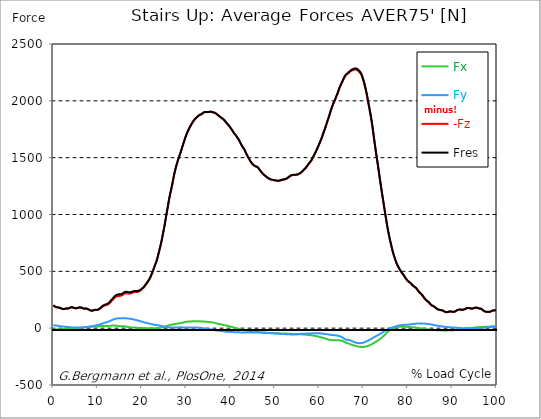
| Category |  Fx |  Fy |  -Fz |  Fres |
|---|---|---|---|---|
| 0.0 | -10.985 | 26.867 | 199.371 | 201.648 |
| 0.16678370786516855 | -11.29 | 25.648 | 194.254 | 196.474 |
| 0.3335674157303371 | -11.566 | 24.466 | 189.281 | 191.444 |
| 0.5003511235955057 | -11.538 | 23.638 | 185.613 | 187.738 |
| 0.6671348314606742 | -11.347 | 22.913 | 183.565 | 185.623 |
| 0.8339185393258427 | -10.995 | 22.027 | 182.326 | 184.251 |
| 1.0007022471910114 | -10.433 | 20.932 | 181.478 | 183.241 |
| 1.1674859550561796 | -9.975 | 19.693 | 180.706 | 182.317 |
| 1.3342696629213484 | -9.813 | 18.569 | 179.363 | 180.859 |
| 1.5010533707865168 | -9.747 | 17.483 | 177.467 | 178.896 |
| 1.6678370786516854 | -9.689 | 16.578 | 175.057 | 176.419 |
| 1.8346207865168538 | -9.404 | 15.835 | 172.408 | 173.704 |
| 2.001404494382023 | -8.794 | 15.206 | 169.331 | 170.588 |
| 2.1681882022471908 | -8.155 | 14.567 | 166.854 | 168.045 |
| 2.334971910112359 | -7.393 | 13.967 | 166.749 | 167.844 |
| 2.501755617977528 | -6.288 | 13.443 | 168.235 | 169.235 |
| 2.668539325842697 | -5.164 | 12.662 | 170.512 | 171.379 |
| 2.8353230337078656 | -4.535 | 11.719 | 172.599 | 173.37 |
| 3.0021067415730336 | -4.402 | 10.985 | 173.246 | 173.98 |
| 3.168890449438202 | -4.144 | 10.309 | 173.094 | 173.809 |
| 3.335674157303371 | -3.697 | 9.708 | 172.923 | 173.589 |
| 3.502457865168539 | -2.858 | 9.089 | 175.276 | 175.895 |
| 3.6692415730337076 | -2.21 | 8.441 | 177.982 | 178.544 |
| 3.8360252808988764 | -1.41 | 7.736 | 181.516 | 182.05 |
| 4.002808988764046 | -0.696 | 7.136 | 184.184 | 184.698 |
| 4.169592696629214 | -0.238 | 6.726 | 184.308 | 184.803 |
| 4.3363764044943816 | 0.019 | 6.393 | 182.574 | 183.06 |
| 4.50316011235955 | 0.152 | 6.155 | 180.602 | 181.078 |
| 4.669943820224718 | 0.21 | 5.945 | 178.001 | 178.477 |
| 4.836727528089888 | 0.391 | 5.755 | 175.752 | 176.238 |
| 5.003511235955056 | 1.038 | 5.574 | 175.038 | 175.533 |
| 5.170294943820225 | 1.934 | 5.412 | 175.19 | 175.686 |
| 5.337078651685394 | 2.696 | 5.25 | 176.19 | 176.695 |
| 5.5038623595505625 | 3.401 | 5.011 | 177.944 | 178.448 |
| 5.670646067415731 | 4.002 | 4.764 | 180.154 | 180.659 |
| 5.837429775280899 | 4.573 | 4.497 | 182.469 | 182.964 |
| 6.004213483146067 | 4.907 | 4.449 | 183.088 | 183.584 |
| 6.170997191011236 | 5.24 | 4.687 | 181.84 | 182.345 |
| 6.329002808988764 | 5.526 | 4.935 | 179.992 | 180.506 |
| 6.495786516853932 | 6.145 | 5.316 | 177.61 | 178.134 |
| 6.662570224719101 | 6.926 | 5.936 | 174.704 | 175.257 |
| 6.82935393258427 | 7.612 | 6.45 | 172.427 | 173.027 |
| 6.9961376404494375 | 8.413 | 6.945 | 171.255 | 171.894 |
| 7.162921348314607 | 9.346 | 7.508 | 171.636 | 172.332 |
| 7.329705056179775 | 10.185 | 8.041 | 172.332 | 173.075 |
| 7.496488764044945 | 10.785 | 8.727 | 171.808 | 172.618 |
| 7.663272471910113 | 11.166 | 9.823 | 169.94 | 170.827 |
| 7.830056179775281 | 11.395 | 10.842 | 167.101 | 168.083 |
| 7.996839887640449 | 11.595 | 12.119 | 162.795 | 163.881 |
| 8.16362359550562 | 11.824 | 13.5 | 158.231 | 159.441 |
| 8.330407303370787 | 12.147 | 14.767 | 155.792 | 157.155 |
| 8.497191011235955 | 12.586 | 15.92 | 153.544 | 155.068 |
| 8.663974719101123 | 13.129 | 16.997 | 152.296 | 153.992 |
| 8.830758426966291 | 13.786 | 18.131 | 153.239 | 155.087 |
| 8.99754213483146 | 14.272 | 19.264 | 154.887 | 156.878 |
| 9.16432584269663 | 14.663 | 20.427 | 157.126 | 159.26 |
| 9.331109550561798 | 14.701 | 21.532 | 158.927 | 161.175 |
| 9.497893258426966 | 14.444 | 22.618 | 159.051 | 161.423 |
| 9.664676966292134 | 14.482 | 24.266 | 159.108 | 161.737 |
| 9.831460674157304 | 14.529 | 25.905 | 159.165 | 162.052 |
| 9.998244382022472 | 14.853 | 27.82 | 159.851 | 163.081 |
| 10.16502808988764 | 15.701 | 29.726 | 162.299 | 165.891 |
| 10.331811797752808 | 16.511 | 31.621 | 166.063 | 169.998 |
| 10.498595505617978 | 17.311 | 33.527 | 170.16 | 174.409 |
| 10.665379213483147 | 17.969 | 35.652 | 175.257 | 179.859 |
| 10.832162921348315 | 18.483 | 37.9 | 181.259 | 186.213 |
| 10.998946629213483 | 18.969 | 40.11 | 187.147 | 192.454 |
| 11.165730337078653 | 19.245 | 42.149 | 191.692 | 197.322 |
| 11.33251404494382 | 19.198 | 44.207 | 195.455 | 201.438 |
| 11.49929775280899 | 19.131 | 46.227 | 198.256 | 204.611 |
| 11.666081460674157 | 19.16 | 48.695 | 200.495 | 207.336 |
| 11.832865168539326 | 18.845 | 50.572 | 202.057 | 209.27 |
| 11.999648876404493 | 18.531 | 52.182 | 203.572 | 211.118 |
| 12.166432584269662 | 18.416 | 54.097 | 205.535 | 213.49 |
| 12.333216292134832 | 18.931 | 56.612 | 209.041 | 217.53 |
| 12.5 | 19.569 | 59.013 | 213.376 | 222.37 |
| 12.66678370786517 | 20.341 | 61.366 | 219.073 | 228.515 |
| 12.833567415730336 | 21.227 | 63.872 | 225.885 | 235.794 |
| 13.000351123595506 | 21.894 | 67.264 | 233.86 | 244.407 |
| 13.167134831460674 | 22.523 | 70.446 | 240.777 | 251.952 |
| 13.333918539325843 | 22.751 | 72.97 | 246.741 | 258.374 |
| 13.500702247191011 | 22.666 | 75.705 | 252.896 | 265.015 |
| 13.667485955056181 | 22.599 | 78.334 | 260.403 | 272.922 |
| 13.834269662921349 | 22.447 | 80.85 | 267.682 | 280.582 |
| 14.001053370786519 | 21.818 | 82.641 | 273.246 | 286.356 |
| 14.167837078651687 | 21.437 | 83.984 | 277.01 | 290.3 |
| 14.334620786516853 | 20.998 | 85.118 | 280.182 | 293.616 |
| 14.501404494382026 | 20.589 | 85.794 | 282.421 | 295.931 |
| 14.668188202247192 | 20.074 | 86.166 | 283.841 | 297.379 |
| 14.834971910112362 | 19.16 | 86.147 | 284.012 | 297.513 |
| 15.001755617977528 | 18.293 | 86.137 | 284.05 | 297.522 |
| 15.168539325842698 | 17.416 | 86.128 | 284.088 | 297.532 |
| 15.335323033707864 | 17.025 | 86.366 | 286.07 | 299.475 |
| 15.502106741573034 | 16.835 | 86.919 | 289.062 | 302.476 |
| 15.6688904494382 | 16.644 | 87.309 | 293.139 | 306.468 |
| 15.83567415730337 | 16.482 | 87.786 | 298.275 | 311.508 |
| 16.00245786516854 | 16.12 | 88.033 | 302.886 | 315.967 |
| 16.16924157303371 | 15.568 | 87.919 | 306.001 | 318.883 |
| 16.336025280898877 | 14.739 | 87.49 | 307.059 | 319.75 |
| 16.502808988764045 | 13.472 | 86.861 | 307.345 | 319.807 |
| 16.669592696629216 | 12.224 | 86.042 | 306.64 | 318.873 |
| 16.83637640449438 | 10.814 | 85.118 | 305.458 | 317.482 |
| 17.003160112359552 | 9.566 | 84.375 | 304.677 | 316.539 |
| 17.169943820224717 | 8.308 | 83.479 | 304.382 | 316.043 |
| 17.336727528089888 | 7.288 | 82.431 | 305.011 | 316.386 |
| 17.503511235955056 | 6.926 | 81.383 | 306.849 | 317.911 |
| 17.670294943820224 | 6.517 | 80.345 | 308.869 | 319.635 |
| 17.837078651685395 | 6.669 | 79.182 | 311.718 | 322.122 |
| 18.003862359550563 | 6.86 | 77.991 | 314.357 | 324.408 |
| 18.17064606741573 | 6.803 | 76.715 | 316.52 | 326.219 |
| 18.3374297752809 | 6.288 | 75.267 | 317.92 | 327.248 |
| 18.504213483146067 | 5.316 | 73.685 | 318.082 | 327.067 |
| 18.662219101123597 | 4.135 | 71.932 | 317.92 | 326.504 |
| 18.829002808988765 | 2.944 | 70.065 | 317.673 | 325.828 |
| 18.995786516853933 | 2.268 | 68.235 | 318.816 | 326.571 |
| 19.1625702247191 | 1.877 | 65.958 | 321.331 | 328.562 |
| 19.32935393258427 | 1.629 | 64.024 | 324.609 | 331.373 |
| 19.49613764044944 | 1.381 | 62.376 | 328.658 | 335.07 |
| 19.662921348314608 | 0.991 | 60.804 | 332.573 | 338.709 |
| 19.829705056179776 | 0.657 | 58.937 | 338.147 | 343.882 |
| 19.996488764044944 | 0.343 | 57.174 | 343.358 | 348.789 |
| 20.163272471910112 | -0.086 | 55.421 | 348.284 | 353.467 |
| 20.33005617977528 | -0.638 | 53.554 | 354.429 | 359.288 |
| 20.49683988764045 | -1.058 | 51.572 | 363.014 | 367.472 |
| 20.663623595505616 | -1.353 | 49.609 | 372.236 | 376.295 |
| 20.830407303370787 | -1.181 | 47.628 | 382.287 | 386.013 |
| 20.997191011235955 | -1.277 | 46.237 | 391.329 | 394.93 |
| 21.163974719101123 | -1.582 | 45.103 | 398.522 | 402.047 |
| 21.330758426966295 | -1.705 | 43.617 | 407.554 | 410.889 |
| 21.497542134831463 | -1.534 | 41.759 | 419.463 | 422.512 |
| 21.66432584269663 | -1.524 | 40.377 | 430.925 | 433.812 |
| 21.8311095505618 | -1.562 | 39.072 | 442.053 | 444.778 |
| 21.997893258426966 | -1.239 | 36.976 | 457.592 | 460.022 |
| 22.164676966292134 | -1.429 | 35.623 | 473.074 | 475.408 |
| 22.331460674157306 | -1.572 | 34.384 | 488.032 | 490.271 |
| 22.498244382022467 | -1.162 | 32.441 | 506.534 | 508.507 |
| 22.66502808988764 | -0.877 | 30.697 | 525.303 | 527.047 |
| 22.831811797752806 | -0.629 | 29.535 | 543.596 | 545.225 |
| 22.99859550561798 | -0.381 | 28.754 | 560.774 | 562.318 |
| 23.165379213483146 | -0.143 | 28.192 | 577.342 | 578.8 |
| 23.332162921348313 | 0.095 | 27.906 | 596.292 | 597.664 |
| 23.49894662921348 | 0.524 | 26.658 | 620.559 | 621.797 |
| 23.665730337078653 | 1.439 | 25.019 | 646.349 | 647.435 |
| 23.83251404494382 | 2.668 | 23.571 | 672.188 | 673.15 |
| 23.999297752808985 | 4.411 | 22.656 | 697.959 | 698.855 |
| 24.166081460674157 | 5.669 | 21.665 | 724.627 | 725.465 |
| 24.332865168539325 | 6.536 | 20.189 | 754.019 | 754.781 |
| 24.499648876404496 | 7.279 | 18.721 | 784.621 | 785.316 |
| 24.666432584269664 | 8.451 | 16.949 | 817.928 | 818.557 |
| 24.833216292134832 | 9.737 | 15.063 | 852.246 | 852.818 |
| 25.0 | 11.157 | 13.758 | 885.468 | 886.002 |
| 25.16678370786517 | 12.757 | 12.595 | 920.891 | 921.425 |
| 25.33356741573034 | 14.882 | 11.404 | 960.106 | 960.649 |
| 25.500351123595504 | 17.254 | 10.452 | 997.558 | 998.13 |
| 25.66713483146067 | 19.655 | 9.842 | 1035.468 | 1036.087 |
| 25.833918539325843 | 21.723 | 9.203 | 1070.891 | 1071.567 |
| 26.00070224719101 | 24.4 | 7.974 | 1109.982 | 1110.715 |
| 26.16748595505618 | 26.524 | 6.841 | 1145.1 | 1145.891 |
| 26.334269662921347 | 28.182 | 6.183 | 1176.988 | 1177.827 |
| 26.50105337078652 | 29.068 | 5.774 | 1206.361 | 1207.209 |
| 26.667837078651687 | 30.335 | 5.564 | 1236.211 | 1237.097 |
| 26.834620786516858 | 32.107 | 5.421 | 1268.118 | 1269.052 |
| 27.001404494382022 | 33.689 | 5.593 | 1300.997 | 1301.978 |
| 27.16818820224719 | 35.118 | 6.088 | 1334.981 | 1335.991 |
| 27.334971910112362 | 36.5 | 6.431 | 1365.879 | 1366.917 |
| 27.50175561797753 | 37.567 | 6.421 | 1392.794 | 1393.851 |
| 27.668539325842698 | 38.519 | 6.307 | 1418.68 | 1419.756 |
| 27.835323033707866 | 39.291 | 6.155 | 1441.393 | 1442.47 |
| 28.002106741573037 | 40.177 | 6.155 | 1463.049 | 1464.135 |
| 28.168890449438205 | 41.111 | 6.336 | 1485.229 | 1486.324 |
| 28.335674157303373 | 42.092 | 6.822 | 1505.027 | 1506.113 |
| 28.502457865168537 | 43.064 | 7.412 | 1522.652 | 1523.719 |
| 28.669241573033705 | 44.169 | 8.003 | 1541.421 | 1542.479 |
| 28.836025280898877 | 45.303 | 8.232 | 1561.886 | 1562.944 |
| 29.002808988764052 | 46.875 | 7.622 | 1582.856 | 1583.914 |
| 29.169592696629213 | 48.58 | 6.907 | 1603.483 | 1604.531 |
| 29.336376404494384 | 50.343 | 6.298 | 1623.529 | 1624.577 |
| 29.50316011235955 | 52.077 | 5.802 | 1643.565 | 1644.622 |
| 29.669943820224724 | 53.401 | 6.469 | 1664.115 | 1665.192 |
| 29.836727528089884 | 55.059 | 6.593 | 1682.665 | 1683.761 |
| 30.003511235955056 | 56.031 | 6.841 | 1700.367 | 1701.472 |
| 30.170294943820224 | 56.783 | 6.831 | 1716.83 | 1717.945 |
| 30.337078651685395 | 57.593 | 6.45 | 1731.531 | 1732.656 |
| 30.503862359550563 | 58.155 | 6.364 | 1745.479 | 1746.613 |
| 30.670646067415728 | 58.365 | 6.174 | 1759.037 | 1760.161 |
| 30.837429775280903 | 58.775 | 5.917 | 1771.356 | 1772.49 |
| 30.99543539325843 | 59.299 | 6.107 | 1783.113 | 1784.246 |
| 31.162219101123597 | 59.794 | 6.555 | 1794.698 | 1795.841 |
| 31.32900280898876 | 59.918 | 6.945 | 1805.845 | 1806.979 |
| 31.495786516853936 | 59.861 | 7.184 | 1816.544 | 1817.669 |
| 31.6625702247191 | 60.204 | 6.669 | 1825.738 | 1826.863 |
| 31.82935393258427 | 60.299 | 6.269 | 1834.456 | 1835.58 |
| 31.996137640449433 | 60.032 | 6.021 | 1841.754 | 1842.859 |
| 32.162921348314605 | 59.966 | 5.65 | 1848.061 | 1849.157 |
| 32.329705056179776 | 60.175 | 5.364 | 1853.597 | 1854.692 |
| 32.49648876404494 | 60.747 | 5.011 | 1858.732 | 1859.846 |
| 32.66327247191011 | 61.004 | 4.649 | 1865.41 | 1866.535 |
| 32.83005617977528 | 60.118 | 4.287 | 1872.137 | 1873.213 |
| 32.996839887640455 | 59.68 | 3.687 | 1875.767 | 1876.824 |
| 33.16362359550562 | 59.708 | 2.839 | 1878.168 | 1879.225 |
| 33.330407303370784 | 59.851 | 1.991 | 1880.188 | 1881.245 |
| 33.497191011235955 | 59.68 | 1.124 | 1883.455 | 1884.503 |
| 33.66397471910113 | 59.508 | -0.038 | 1889.724 | 1890.763 |
| 33.83075842696629 | 59.213 | -1.01 | 1895.546 | 1896.565 |
| 33.997542134831455 | 58.336 | -1.696 | 1899.195 | 1900.186 |
| 34.164325842696634 | 57.536 | -2.677 | 1900.643 | 1901.605 |
| 34.3311095505618 | 56.841 | -3.706 | 1901.376 | 1902.329 |
| 34.49789325842697 | 56.345 | -4.602 | 1900.91 | 1901.843 |
| 34.66467696629213 | 55.888 | -5.488 | 1900.214 | 1901.148 |
| 34.831460674157306 | 55.307 | -6.345 | 1900.09 | 1901.005 |
| 34.99824438202247 | 54.459 | -7.346 | 1901.062 | 1901.958 |
| 35.16502808988764 | 53.487 | -8.632 | 1902.767 | 1903.654 |
| 35.331811797752806 | 52.553 | -9.861 | 1904.197 | 1905.054 |
| 35.49859550561798 | 51.743 | -10.909 | 1904.044 | 1904.892 |
| 35.66537921348315 | 51.057 | -11.995 | 1902.939 | 1903.777 |
| 35.83216292134831 | 50.476 | -13.3 | 1900.624 | 1901.462 |
| 35.998946629213485 | 49.809 | -14.644 | 1897.889 | 1898.728 |
| 36.16573033707865 | 48.571 | -15.854 | 1896.822 | 1897.651 |
| 36.33251404494382 | 47.285 | -17.083 | 1895.774 | 1896.584 |
| 36.499297752808985 | 45.503 | -18.226 | 1892.163 | 1892.945 |
| 36.666081460674164 | 43.636 | -19.598 | 1888.343 | 1889.105 |
| 36.83286516853932 | 41.778 | -20.694 | 1883.436 | 1884.18 |
| 36.99964887640449 | 39.729 | -21.522 | 1877.92 | 1878.625 |
| 37.166432584269664 | 38.081 | -22.256 | 1873.09 | 1873.795 |
| 37.333216292134836 | 36.528 | -22.913 | 1868.078 | 1868.764 |
| 37.5 | 35.166 | -23.333 | 1862.619 | 1863.305 |
| 37.666783707865164 | 34.165 | -24.133 | 1857.188 | 1857.865 |
| 37.833567415730336 | 33.108 | -24.857 | 1851.815 | 1852.491 |
| 38.00035112359551 | 31.631 | -25.6 | 1847.909 | 1848.566 |
| 38.16713483146068 | 30.011 | -26.496 | 1844.031 | 1844.66 |
| 38.333918539325836 | 28.144 | -27.258 | 1838.219 | 1838.839 |
| 38.50070224719101 | 26.486 | -28.001 | 1832.131 | 1832.741 |
| 38.66748595505618 | 24.971 | -28.935 | 1825.538 | 1826.138 |
| 38.83426966292135 | 23.733 | -29.783 | 1817.402 | 1818.002 |
| 39.001053370786515 | 22.913 | -30.526 | 1808.513 | 1809.123 |
| 39.16783707865169 | 21.808 | -31.05 | 1800.091 | 1800.681 |
| 39.33462078651686 | 20.474 | -31.612 | 1792.897 | 1793.479 |
| 39.50140449438202 | 19.026 | -31.984 | 1786.057 | 1786.628 |
| 39.668188202247194 | 17.34 | -32.527 | 1778.082 | 1778.644 |
| 39.83497191011236 | 15.473 | -33.051 | 1769.041 | 1769.593 |
| 40.00175561797753 | 13.567 | -33.451 | 1759.952 | 1760.504 |
| 40.168539325842694 | 11.652 | -33.727 | 1750.691 | 1751.224 |
| 40.335323033707866 | 9.899 | -33.975 | 1741.068 | 1741.602 |
| 40.50210674157304 | 8.108 | -34.28 | 1731.322 | 1731.865 |
| 40.6688904494382 | 6.317 | -34.613 | 1721.375 | 1721.909 |
| 40.83567415730337 | 4.583 | -34.956 | 1711.324 | 1711.867 |
| 41.00245786516854 | 2.677 | -35.328 | 1703.988 | 1704.531 |
| 41.16924157303371 | 0.81 | -35.671 | 1696.337 | 1696.88 |
| 41.33602528089887 | -0.924 | -35.823 | 1687.029 | 1687.572 |
| 41.502808988764045 | -2.706 | -35.89 | 1676.872 | 1677.425 |
| 41.669592696629216 | -4.44 | -36.014 | 1666.745 | 1667.307 |
| 41.83637640449439 | -6.117 | -36.204 | 1656.503 | 1657.075 |
| 42.00316011235955 | -8.022 | -36.585 | 1645.013 | 1645.604 |
| 42.16994382022472 | -10.023 | -37.376 | 1631.589 | 1632.208 |
| 42.33672752808989 | -11.623 | -37.967 | 1619.079 | 1619.737 |
| 42.50351123595506 | -12.938 | -38.329 | 1607.065 | 1607.751 |
| 42.670294943820224 | -14.139 | -38.691 | 1597.109 | 1597.814 |
| 42.83707865168539 | -15.806 | -38.424 | 1587.505 | 1588.22 |
| 43.00386235955057 | -17.502 | -38.186 | 1577.749 | 1578.473 |
| 43.17064606741573 | -19.055 | -37.7 | 1565.021 | 1565.764 |
| 43.32865168539326 | -20.398 | -37.386 | 1550.844 | 1551.606 |
| 43.495435393258425 | -21.389 | -37.338 | 1536.41 | 1537.191 |
| 43.6622191011236 | -22.075 | -37.147 | 1523.062 | 1523.853 |
| 43.82900280898876 | -22.351 | -36.766 | 1511.21 | 1512.001 |
| 43.99578651685393 | -22.771 | -36.947 | 1499.501 | 1500.31 |
| 44.162570224719104 | -23.199 | -37.195 | 1487.925 | 1488.754 |
| 44.32935393258427 | -23.599 | -37.443 | 1476.711 | 1477.569 |
| 44.49613764044944 | -24 | -37.69 | 1465.507 | 1466.374 |
| 44.66292134831461 | -24.809 | -38.081 | 1455.856 | 1456.761 |
| 44.82970505617978 | -25.81 | -38.176 | 1447.071 | 1448.014 |
| 44.99648876404493 | -26.886 | -38.157 | 1439.983 | 1440.945 |
| 45.16327247191011 | -27.982 | -38.1 | 1433.676 | 1434.667 |
| 45.33005617977528 | -29.011 | -38.195 | 1429.627 | 1430.646 |
| 45.49683988764045 | -29.973 | -38.31 | 1426.13 | 1427.169 |
| 45.66362359550561 | -30.716 | -38.329 | 1421.909 | 1422.967 |
| 45.83040730337079 | -31.812 | -38.529 | 1420.071 | 1421.157 |
| 45.99719101123596 | -32.936 | -38.748 | 1418.365 | 1419.47 |
| 46.16397471910113 | -33.86 | -38.51 | 1413.23 | 1414.345 |
| 46.33075842696629 | -34.537 | -37.938 | 1403.979 | 1405.113 |
| 46.497542134831455 | -34.804 | -38.529 | 1394.042 | 1395.204 |
| 46.66432584269663 | -35.413 | -38.748 | 1385.867 | 1387.068 |
| 46.83110955056179 | -35.652 | -39.31 | 1377.921 | 1379.16 |
| 46.99789325842696 | -36.157 | -39.548 | 1369.251 | 1370.528 |
| 47.164676966292134 | -36.652 | -39.767 | 1361.906 | 1363.201 |
| 47.331460674157306 | -37.414 | -39.672 | 1355.217 | 1356.542 |
| 47.49824438202247 | -38.319 | -39.501 | 1348.91 | 1350.273 |
| 47.66502808988764 | -39.11 | -39.634 | 1343.232 | 1344.623 |
| 47.83181179775281 | -40.025 | -39.748 | 1338.059 | 1339.497 |
| 47.99859550561797 | -41.006 | -39.939 | 1333.762 | 1335.238 |
| 48.16537921348314 | -40.996 | -41.035 | 1327.483 | 1328.989 |
| 48.33216292134831 | -40.968 | -41.911 | 1322.005 | 1323.539 |
| 48.498946629213485 | -41.349 | -42.245 | 1318.47 | 1320.033 |
| 48.66573033707865 | -41.597 | -42.502 | 1314.783 | 1316.374 |
| 48.83251404494382 | -41.654 | -43.054 | 1311.325 | 1312.935 |
| 48.99929775280899 | -41.682 | -43.75 | 1308.028 | 1309.667 |
| 49.166081460674164 | -41.978 | -44.15 | 1306.066 | 1307.733 |
| 49.33286516853933 | -42.416 | -44.388 | 1304.351 | 1306.046 |
| 49.499648876404486 | -42.902 | -44.884 | 1302.969 | 1304.694 |
| 49.666432584269664 | -43.464 | -45.703 | 1302.035 | 1303.808 |
| 49.83321629213483 | -43.979 | -46.379 | 1301.073 | 1302.883 |
| 50.0 | -44.312 | -46.837 | 1299.892 | 1301.731 |
| 50.166783707865164 | -44.331 | -47.17 | 1298.32 | 1300.168 |
| 50.33356741573034 | -44.322 | -47.475 | 1296.948 | 1298.796 |
| 50.50035112359551 | -44.302 | -47.971 | 1295.805 | 1297.672 |
| 50.66713483146068 | -44.483 | -48.78 | 1295.462 | 1297.367 |
| 50.83391853932584 | -44.941 | -49.447 | 1295.928 | 1297.881 |
| 51.00070224719101 | -45.417 | -50.019 | 1296.929 | 1298.93 |
| 51.16748595505618 | -45.76 | -50.6 | 1298.529 | 1300.559 |
| 51.33426966292134 | -46.075 | -51.134 | 1300.197 | 1302.264 |
| 51.50105337078652 | -46.16 | -51.21 | 1302.883 | 1304.951 |
| 51.66783707865169 | -46.284 | -51.296 | 1305.179 | 1307.247 |
| 51.83462078651686 | -46.389 | -51.477 | 1306.428 | 1308.514 |
| 52.00140449438202 | -46.437 | -51.743 | 1307.237 | 1309.324 |
| 52.168188202247194 | -46.694 | -52.22 | 1308.514 | 1310.629 |
| 52.33497191011236 | -46.961 | -52.62 | 1310.191 | 1312.325 |
| 52.50175561797752 | -47.266 | -52.82 | 1312.83 | 1314.974 |
| 52.668539325842694 | -47.58 | -52.82 | 1316.146 | 1318.289 |
| 52.835323033707866 | -47.828 | -53.096 | 1319.966 | 1322.129 |
| 53.00210674157304 | -48.256 | -53.277 | 1325.035 | 1327.207 |
| 53.1688904494382 | -48.752 | -53.573 | 1330.218 | 1332.399 |
| 53.33567415730337 | -49.342 | -54.02 | 1335.524 | 1337.735 |
| 53.502457865168545 | -49.685 | -54.887 | 1339.745 | 1341.993 |
| 53.669241573033716 | -50.114 | -55.831 | 1343.08 | 1345.376 |
| 53.83602528089887 | -50.6 | -56.288 | 1345.09 | 1347.405 |
| 54.002808988764045 | -50.819 | -56.698 | 1345.9 | 1348.234 |
| 54.169592696629216 | -51.096 | -56.841 | 1347.005 | 1349.358 |
| 54.33637640449438 | -51.277 | -56.488 | 1347.338 | 1349.692 |
| 54.50316011235955 | -51.458 | -56.174 | 1347.891 | 1350.244 |
| 54.669943820224724 | -51.696 | -55.707 | 1348.529 | 1350.863 |
| 54.836727528089895 | -51.943 | -55.097 | 1348.92 | 1351.235 |
| 55.00351123595506 | -52.201 | -54.411 | 1349.491 | 1351.788 |
| 55.17029494382022 | -52.477 | -53.134 | 1351.454 | 1353.703 |
| 55.337078651685395 | -52.753 | -51.943 | 1353.655 | 1355.856 |
| 55.50386235955056 | -53.115 | -51.334 | 1357.571 | 1359.772 |
| 55.66186797752809 | -53.487 | -50.638 | 1361.801 | 1363.983 |
| 55.82865168539326 | -53.839 | -50.057 | 1366.822 | 1368.985 |
| 55.995435393258425 | -54.211 | -49.514 | 1372.348 | 1374.51 |
| 56.1622191011236 | -54.668 | -48.971 | 1378.169 | 1380.322 |
| 56.32900280898877 | -55.335 | -48.418 | 1384.695 | 1386.848 |
| 56.49578651685393 | -56.116 | -47.99 | 1391.679 | 1393.832 |
| 56.6625702247191 | -56.755 | -47.923 | 1398.539 | 1400.692 |
| 56.82935393258427 | -57.307 | -48.047 | 1405.303 | 1407.475 |
| 56.99613764044943 | -57.85 | -48.266 | 1412.439 | 1414.63 |
| 57.16292134831461 | -58.451 | -48.113 | 1420.414 | 1422.605 |
| 57.329705056179776 | -58.927 | -47.799 | 1429.446 | 1431.618 |
| 57.49648876404495 | -59.48 | -47.504 | 1439.335 | 1441.498 |
| 57.66327247191011 | -60.089 | -47.266 | 1448.739 | 1450.892 |
| 57.83005617977529 | -60.928 | -46.865 | 1455.903 | 1458.056 |
| 57.99683988764044 | -62.023 | -46.399 | 1463.563 | 1465.726 |
| 58.16362359550561 | -62.824 | -46.113 | 1472.767 | 1474.929 |
| 58.33040730337079 | -63.491 | -45.589 | 1484.362 | 1486.515 |
| 58.497191011235955 | -64.253 | -45.141 | 1497.595 | 1499.758 |
| 58.66397471910112 | -65.187 | -44.512 | 1509.495 | 1511.667 |
| 58.83075842696629 | -66.101 | -44.036 | 1521.719 | 1523.9 |
| 58.99754213483147 | -66.94 | -43.979 | 1534.866 | 1537.077 |
| 59.164325842696634 | -67.788 | -43.921 | 1548.024 | 1550.244 |
| 59.33110955056179 | -69.302 | -43.626 | 1561.772 | 1564.02 |
| 59.49789325842697 | -70.951 | -43.416 | 1575.93 | 1578.216 |
| 59.664676966292134 | -72.561 | -43.826 | 1591.297 | 1593.66 |
| 59.8314606741573 | -74.095 | -44.483 | 1606.522 | 1608.961 |
| 59.99824438202247 | -75.724 | -45.027 | 1620.67 | 1623.176 |
| 60.16502808988765 | -77.458 | -45.541 | 1635.981 | 1638.563 |
| 60.33181179775281 | -79.259 | -46.132 | 1652.101 | 1654.759 |
| 60.49859550561798 | -81.174 | -46.932 | 1668.25 | 1670.994 |
| 60.66537921348315 | -83.193 | -47.932 | 1686.086 | 1688.934 |
| 60.83216292134831 | -85.166 | -48.895 | 1705.379 | 1708.313 |
| 60.99894662921348 | -87.128 | -49.905 | 1724.081 | 1727.12 |
| 61.16573033707864 | -89.043 | -50.61 | 1741.468 | 1744.584 |
| 61.33251404494383 | -91.158 | -51.439 | 1760.371 | 1763.581 |
| 61.49929775280899 | -93.188 | -52.334 | 1780.131 | 1783.437 |
| 61.66608146067416 | -95.579 | -52.972 | 1800.529 | 1803.94 |
| 61.83286516853932 | -97.751 | -53.706 | 1820.413 | 1823.919 |
| 61.99964887640451 | -99.638 | -54.811 | 1839.953 | 1843.555 |
| 62.16643258426967 | -101.238 | -55.745 | 1857.941 | 1861.628 |
| 62.33321629213482 | -102.734 | -56.964 | 1879.673 | 1883.446 |
| 62.5 | -104.211 | -58.184 | 1901.386 | 1905.235 |
| 62.66678370786517 | -105.097 | -59.203 | 1920.927 | 1924.814 |
| 62.833567415730336 | -105.478 | -60.004 | 1939.867 | 1943.754 |
| 63.0003511235955 | -106.069 | -60.775 | 1958.455 | 1962.352 |
| 63.16713483146068 | -106.345 | -61.252 | 1974.537 | 1978.434 |
| 63.33391853932585 | -106.04 | -61.509 | 1989.677 | 1993.535 |
| 63.500702247191015 | -105.897 | -61.976 | 2004.72 | 2008.55 |
| 63.66748595505618 | -105.659 | -62.633 | 2019.297 | 2023.108 |
| 63.83426966292135 | -105.592 | -63.31 | 2036.161 | 2039.962 |
| 64.00105337078651 | -105.611 | -64.443 | 2052.967 | 2056.778 |
| 64.16783707865169 | -105.611 | -65.701 | 2069.307 | 2073.137 |
| 64.33462078651687 | -106.002 | -67.426 | 2088.342 | 2092.22 |
| 64.50140449438203 | -106.65 | -69.417 | 2107.388 | 2111.332 |
| 64.6681882022472 | -107.107 | -71.532 | 2123.622 | 2127.624 |
| 64.83497191011236 | -107.622 | -74.047 | 2137.752 | 2141.858 |
| 65.00175561797754 | -108.717 | -76.562 | 2151.195 | 2155.425 |
| 65.16853932584269 | -110.623 | -80.402 | 2165.067 | 2169.545 |
| 65.33532303370787 | -113.576 | -84.708 | 2178.958 | 2183.769 |
| 65.50210674157304 | -117.263 | -88.986 | 2193.363 | 2198.546 |
| 65.66889044943821 | -120.693 | -93.521 | 2205.311 | 2210.855 |
| 65.83567415730337 | -124.39 | -97.456 | 2215.981 | 2221.869 |
| 66.00245786516854 | -127.886 | -101.086 | 2225.509 | 2231.721 |
| 66.1692415730337 | -129.744 | -102.429 | 2230.787 | 2237.151 |
| 66.33602528089888 | -131.478 | -103.01 | 2235.579 | 2242.048 |
| 66.50280898876404 | -133.841 | -103.534 | 2240.448 | 2247.06 |
| 66.66959269662921 | -136.661 | -104.278 | 2246.717 | 2253.51 |
| 66.83637640449439 | -139.3 | -105.478 | 2253.014 | 2260.007 |
| 67.00316011235955 | -141.282 | -107.612 | 2258.578 | 2265.781 |
| 67.16994382022472 | -143.597 | -110.194 | 2263.571 | 2271.031 |
| 67.33672752808988 | -145.684 | -113.024 | 2266.886 | 2274.613 |
| 67.50351123595506 | -148.123 | -116.301 | 2267.972 | 2276.013 |
| 67.67029494382022 | -150.419 | -119.512 | 2271.65 | 2279.996 |
| 67.83707865168539 | -152.267 | -122.351 | 2275.509 | 2284.112 |
| 67.99508426966291 | -153.753 | -124.561 | 2276.747 | 2285.55 |
| 68.16186797752809 | -156.002 | -126.696 | 2276.69 | 2285.76 |
| 68.32865168539327 | -158.26 | -128.639 | 2274.956 | 2284.293 |
| 68.49543539325843 | -159.927 | -130.049 | 2271.04 | 2280.587 |
| 68.6622191011236 | -160.861 | -131.126 | 2267.039 | 2276.728 |
| 68.82900280898876 | -161.718 | -131.631 | 2261.665 | 2271.44 |
| 68.99578651685394 | -162.662 | -131.85 | 2255.006 | 2264.876 |
| 69.1625702247191 | -163.433 | -132.059 | 2246.898 | 2256.863 |
| 69.32935393258425 | -164.643 | -132.04 | 2238.047 | 2248.127 |
| 69.49613764044945 | -165.444 | -130.63 | 2226.233 | 2236.332 |
| 69.66292134831461 | -165.691 | -129.249 | 2209.322 | 2219.421 |
| 69.82970505617978 | -165.482 | -128.106 | 2188.923 | 2199.022 |
| 69.99648876404494 | -165.072 | -126.924 | 2167.858 | 2177.957 |
| 70.16327247191012 | -164.357 | -124.485 | 2143.592 | 2153.605 |
| 70.33005617977528 | -162.843 | -121.732 | 2116.82 | 2126.69 |
| 70.49683988764045 | -161.471 | -118.854 | 2089.829 | 2099.556 |
| 70.66362359550561 | -160.146 | -115.949 | 2059.979 | 2069.564 |
| 70.83040730337079 | -158.126 | -112.662 | 2026.1 | 2035.513 |
| 70.99719101123596 | -155.649 | -109.079 | 1990.22 | 1999.404 |
| 71.16397471910112 | -152.839 | -105.564 | 1954.339 | 1963.276 |
| 71.3307584269663 | -150 | -102.334 | 1920.088 | 1928.787 |
| 71.49754213483146 | -147.094 | -99.238 | 1886.256 | 1894.698 |
| 71.66432584269663 | -144.226 | -95.674 | 1849.404 | 1857.598 |
| 71.83110955056179 | -141.13 | -91.73 | 1808.846 | 1816.773 |
| 71.99789325842697 | -137.614 | -87.671 | 1764.763 | 1772.394 |
| 72.16467696629215 | -133.632 | -83.746 | 1716.85 | 1724.195 |
| 72.3314606741573 | -129.706 | -79.821 | 1668.593 | 1675.643 |
| 72.49824438202248 | -125.829 | -76.257 | 1620.127 | 1626.901 |
| 72.66502808988764 | -122.027 | -72.866 | 1573.233 | 1579.741 |
| 72.8318117977528 | -118.111 | -69.283 | 1528.197 | 1534.428 |
| 72.99859550561797 | -113.996 | -65.882 | 1484.352 | 1490.278 |
| 73.16537921348315 | -109.718 | -62.481 | 1443.613 | 1449.215 |
| 73.33216292134833 | -105.459 | -59.032 | 1398.844 | 1404.131 |
| 73.49894662921349 | -101.076 | -55.554 | 1352.521 | 1357.504 |
| 73.66573033707864 | -96.189 | -51.762 | 1308.381 | 1313.002 |
| 73.83251404494382 | -90.958 | -48.018 | 1264.412 | 1268.661 |
| 73.99929775280899 | -85.975 | -43.826 | 1220.519 | 1224.387 |
| 74.16608146067415 | -80.878 | -39.71 | 1178.122 | 1181.628 |
| 74.33286516853933 | -74.962 | -35.585 | 1137.116 | 1140.203 |
| 74.49964887640449 | -68.978 | -31.45 | 1096.053 | 1098.739 |
| 74.66643258426967 | -62.757 | -27.267 | 1054.656 | 1056.952 |
| 74.83321629213484 | -56.193 | -22.856 | 1013.288 | 1015.194 |
| 75.0 | -49.409 | -18.836 | 974.473 | 976.026 |
| 75.16678370786516 | -42.197 | -14.472 | 934.792 | 935.983 |
| 75.33356741573033 | -34.899 | -10.223 | 895.424 | 896.282 |
| 75.5003511235955 | -28.935 | -7.012 | 860.897 | 861.516 |
| 75.66713483146067 | -23.161 | -4.078 | 826.722 | 827.151 |
| 75.83391853932585 | -17.883 | -1.524 | 795.749 | 796.063 |
| 76.00070224719101 | -13.138 | 0.772 | 766.404 | 766.614 |
| 76.16748595505618 | -9.365 | 2.696 | 739.194 | 739.337 |
| 76.33426966292136 | -5.955 | 4.421 | 711.469 | 711.593 |
| 76.50105337078652 | -2.649 | 6.098 | 684.087 | 684.192 |
| 76.66783707865167 | -0.095 | 7.784 | 660.145 | 660.269 |
| 76.83462078651685 | 2.306 | 9.594 | 638.537 | 638.689 |
| 77.00140449438202 | 4.345 | 11.89 | 618.729 | 618.948 |
| 77.1681882022472 | 6.402 | 14.158 | 598.807 | 599.093 |
| 77.33497191011236 | 8.651 | 16.759 | 580.715 | 581.096 |
| 77.50175561797754 | 10.575 | 19.055 | 564.118 | 564.614 |
| 77.6685393258427 | 11.9 | 20.684 | 550.942 | 551.523 |
| 77.83532303370787 | 12.795 | 22.218 | 538.232 | 538.899 |
| 78.00210674157303 | 12.795 | 23.533 | 526.199 | 526.933 |
| 78.1688904494382 | 12.91 | 24.952 | 514.223 | 515.042 |
| 78.33567415730337 | 13.519 | 26.534 | 502.895 | 503.838 |
| 78.50245786516854 | 14.32 | 27.811 | 493.263 | 494.301 |
| 78.66924157303372 | 14.586 | 28.449 | 484.393 | 485.498 |
| 78.83602528089888 | 14.558 | 28.773 | 475.79 | 476.933 |
| 79.00280898876404 | 14.472 | 29.116 | 467.691 | 468.863 |
| 79.16959269662921 | 13.872 | 29.049 | 457.659 | 458.84 |
| 79.33637640449439 | 12.929 | 28.963 | 445.902 | 447.083 |
| 79.50316011235955 | 12.062 | 29.297 | 436.194 | 437.394 |
| 79.66994382022472 | 11.824 | 29.573 | 428.657 | 429.886 |
| 79.8367275280899 | 11.385 | 30.107 | 420.302 | 421.607 |
| 80.00351123595506 | 10.814 | 30.878 | 412.547 | 413.947 |
| 80.17029494382022 | 10.337 | 31.421 | 407.592 | 409.031 |
| 80.32830056179776 | 9.985 | 31.888 | 403.638 | 405.115 |
| 80.49508426966293 | 9.556 | 32.488 | 399.084 | 400.618 |
| 80.66186797752809 | 8.965 | 33.413 | 392.606 | 394.244 |
| 80.82865168539325 | 8.251 | 34.451 | 384.507 | 386.26 |
| 80.99543539325842 | 7.651 | 35.566 | 376.914 | 378.791 |
| 81.1622191011236 | 7.069 | 36.604 | 370.655 | 372.627 |
| 81.32900280898878 | 6.421 | 37.367 | 365.957 | 368.015 |
| 81.49578651685394 | 5.859 | 38.224 | 361.927 | 364.081 |
| 81.6625702247191 | 5.326 | 39.148 | 358.012 | 360.26 |
| 81.82935393258427 | 4.687 | 40.063 | 352.362 | 354.734 |
| 81.99613764044945 | 3.763 | 40.844 | 343.74 | 346.264 |
| 82.16292134831461 | 2.591 | 41.311 | 334.365 | 337.032 |
| 82.32970505617978 | 1.324 | 41.511 | 325.18 | 327.953 |
| 82.49648876404494 | 0.257 | 41.587 | 316.834 | 319.683 |
| 82.66327247191012 | -0.629 | 41.549 | 309.517 | 312.423 |
| 82.83005617977528 | -1.334 | 41.721 | 304.067 | 307.03 |
| 82.99683988764045 | -2.087 | 41.787 | 298.723 | 301.743 |
| 83.16362359550563 | -3.039 | 41.74 | 291.949 | 295.026 |
| 83.33040730337079 | -4.106 | 41.425 | 283.098 | 286.232 |
| 83.49719101123596 | -5.135 | 40.796 | 273.084 | 276.295 |
| 83.66397471910112 | -6.412 | 40.377 | 263.919 | 267.206 |
| 83.8307584269663 | -7.574 | 39.653 | 256.002 | 259.308 |
| 83.99754213483146 | -8.365 | 38.996 | 248.818 | 252.143 |
| 84.16432584269663 | -8.956 | 38.424 | 242.835 | 246.169 |
| 84.33110955056179 | -9.718 | 37.605 | 237.147 | 240.462 |
| 84.49789325842697 | -10.585 | 36.833 | 232.059 | 235.346 |
| 84.66467696629213 | -11.461 | 36.071 | 226.991 | 230.259 |
| 84.8314606741573 | -12.49 | 35.261 | 219.959 | 223.237 |
| 84.99824438202248 | -13.329 | 34.337 | 211.985 | 215.272 |
| 85.16502808988764 | -14.034 | 33.241 | 204.639 | 207.907 |
| 85.3318117977528 | -14.577 | 32.126 | 199.275 | 202.477 |
| 85.49859550561797 | -14.939 | 30.878 | 195.931 | 199.018 |
| 85.66537921348315 | -15.263 | 29.535 | 193.13 | 196.074 |
| 85.83216292134831 | -15.796 | 28.22 | 189.872 | 192.711 |
| 85.99894662921348 | -16.673 | 26.658 | 185.356 | 188.128 |
| 86.16573033707866 | -17.683 | 25.162 | 180.383 | 183.117 |
| 86.33251404494384 | -18.464 | 23.761 | 175.142 | 177.848 |
| 86.499297752809 | -18.912 | 22.609 | 169.817 | 172.522 |
| 86.66608146067415 | -19.198 | 21.494 | 165.282 | 167.94 |
| 86.83286516853933 | -19.283 | 20.636 | 161.852 | 164.472 |
| 86.99964887640449 | -19.283 | 19.741 | 159.622 | 162.166 |
| 87.16643258426966 | -19.169 | 18.712 | 158.622 | 161.042 |
| 87.33321629213482 | -18.988 | 17.769 | 157.965 | 160.28 |
| 87.5 | -18.969 | 16.73 | 157.526 | 159.765 |
| 87.66678370786518 | -19.217 | 15.596 | 156.173 | 158.355 |
| 87.83356741573033 | -19.884 | 14.472 | 153.248 | 155.449 |
| 88.00035112359551 | -20.522 | 13.5 | 150.152 | 152.391 |
| 88.16713483146067 | -21.218 | 12.367 | 146.189 | 148.485 |
| 88.33391853932584 | -21.684 | 11.357 | 142.425 | 144.76 |
| 88.500702247191 | -21.656 | 10.852 | 140.31 | 142.644 |
| 88.66748595505618 | -21.341 | 10.537 | 139.338 | 141.625 |
| 88.83426966292136 | -20.817 | 10.166 | 139.5 | 141.701 |
| 89.00105337078652 | -20.122 | 9.67 | 141.025 | 143.083 |
| 89.16783707865169 | -19.674 | 9.022 | 143.502 | 145.446 |
| 89.33462078651687 | -19.255 | 8.365 | 145.712 | 147.542 |
| 89.50140449438203 | -19.236 | 7.67 | 146.008 | 147.818 |
| 89.6681882022472 | -19.322 | 6.831 | 145.684 | 147.494 |
| 89.83497191011236 | -19.036 | 6.364 | 144.883 | 146.655 |
| 90.00175561797754 | -18.807 | 6.117 | 143.654 | 145.398 |
| 90.16853932584269 | -18.55 | 5.812 | 142.521 | 144.226 |
| 90.33532303370787 | -17.969 | 5.554 | 142.644 | 144.302 |
| 90.50210674157303 | -17.235 | 5.231 | 143.75 | 145.322 |
| 90.6688904494382 | -16.197 | 4.888 | 146.751 | 148.199 |
| 90.83567415730336 | -15.196 | 4.183 | 151.029 | 152.372 |
| 91.00245786516854 | -14.224 | 3.354 | 155.364 | 156.612 |
| 91.1692415730337 | -13.272 | 2.839 | 158.774 | 159.937 |
| 91.33602528089888 | -12.633 | 2.296 | 161.051 | 162.176 |
| 91.50280898876404 | -12.176 | 1.782 | 162.662 | 163.738 |
| 91.66959269662922 | -11.785 | 1.391 | 163.309 | 164.357 |
| 91.83637640449439 | -11.28 | 1.105 | 163.281 | 164.281 |
| 92.00316011235955 | -10.766 | 0.676 | 162.547 | 163.529 |
| 92.16994382022472 | -10.251 | 0.4 | 161.852 | 162.804 |
| 92.3367275280899 | -9.585 | 0.133 | 161.528 | 162.452 |
| 92.50351123595506 | -8.441 | 0.057 | 162.433 | 163.319 |
| 92.66151685393258 | -7.241 | 0.01 | 163.948 | 164.805 |
| 92.82830056179776 | -6.059 | -0.2 | 166.253 | 167.082 |
| 92.99508426966291 | -4.869 | -0.514 | 169.559 | 170.36 |
| 93.16186797752809 | -3.897 | -1.096 | 174.113 | 174.885 |
| 93.32865168539325 | -2.953 | -1.486 | 177.134 | 177.886 |
| 93.49543539325842 | -2.144 | -1.572 | 177.991 | 178.744 |
| 93.66221910112358 | -1.601 | -1.801 | 177.115 | 177.858 |
| 93.82900280898876 | -1.21 | -1.972 | 175.647 | 176.391 |
| 93.99578651685393 | -0.781 | -2.106 | 173.913 | 174.657 |
| 94.1625702247191 | -0.191 | -2.106 | 172.494 | 173.237 |
| 94.32935393258427 | 0.676 | -1.915 | 171.646 | 172.418 |
| 94.49613764044945 | 1.734 | -1.591 | 171.389 | 172.179 |
| 94.66292134831461 | 2.792 | -1.229 | 172.418 | 173.237 |
| 94.82970505617978 | 3.887 | -1.124 | 174.923 | 175.752 |
| 94.99648876404494 | 5.107 | -1.115 | 177.886 | 178.734 |
| 95.16327247191012 | 6.126 | -0.972 | 179.649 | 180.525 |
| 95.33005617977528 | 6.888 | -0.8 | 180.383 | 181.25 |
| 95.49683988764046 | 7.469 | -0.676 | 180.087 | 180.945 |
| 95.66362359550563 | 8.213 | -0.267 | 178.629 | 179.487 |
| 95.83040730337078 | 8.613 | 0.038 | 175.59 | 176.467 |
| 95.99719101123594 | 9.061 | 0.295 | 172.961 | 173.866 |
| 96.16397471910112 | 9.67 | 0.534 | 172.58 | 173.494 |
| 96.33075842696628 | 10.204 | 0.734 | 172.418 | 173.332 |
| 96.49754213483145 | 10.461 | 1.096 | 170.207 | 171.122 |
| 96.66432584269663 | 10.318 | 1.543 | 166.587 | 167.492 |
| 96.8311095505618 | 10.566 | 2.487 | 161.28 | 162.185 |
| 96.99789325842697 | 11.147 | 3.897 | 154.573 | 155.487 |
| 97.16467696629213 | 11.49 | 5.059 | 149.723 | 150.676 |
| 97.3314606741573 | 11.909 | 6.317 | 146.875 | 147.923 |
| 97.49824438202248 | 12.186 | 7.117 | 144.74 | 145.855 |
| 97.66502808988764 | 12.595 | 7.67 | 143.302 | 144.464 |
| 97.8318117977528 | 13.053 | 8.47 | 143.264 | 144.512 |
| 97.99859550561798 | 13.148 | 8.584 | 142.911 | 144.159 |
| 98.16537921348316 | 13.195 | 8.832 | 141.892 | 143.168 |
| 98.33216292134833 | 13.538 | 9.194 | 141.768 | 143.111 |
| 98.49894662921349 | 14.091 | 9.823 | 142.949 | 144.397 |
| 98.66573033707866 | 14.682 | 10.766 | 145.95 | 147.503 |
| 98.8325140449438 | 15.349 | 11.862 | 150.304 | 152.01 |
| 98.99929775280897 | 15.606 | 12.9 | 152.448 | 154.239 |
| 99.16608146067416 | 15.568 | 13.862 | 154.544 | 156.421 |
| 99.33286516853933 | 15.492 | 14.739 | 155.421 | 157.374 |
| 99.49964887640449 | 15.272 | 15.615 | 155.535 | 157.536 |
| 99.66643258426966 | 15.072 | 16.616 | 155.106 | 157.174 |
| 99.83321629213484 | 14.634 | 17.645 | 154.458 | 156.593 |
| 100.0 | 14.158 | 18.674 | 153.811 | 156.011 |